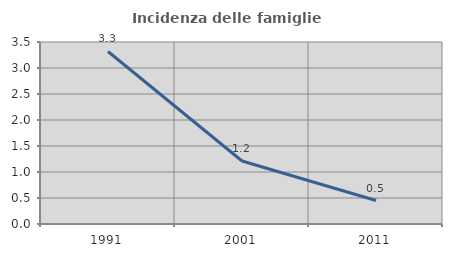
| Category | Incidenza delle famiglie numerose |
|---|---|
| 1991.0 | 3.318 |
| 2001.0 | 1.212 |
| 2011.0 | 0.452 |